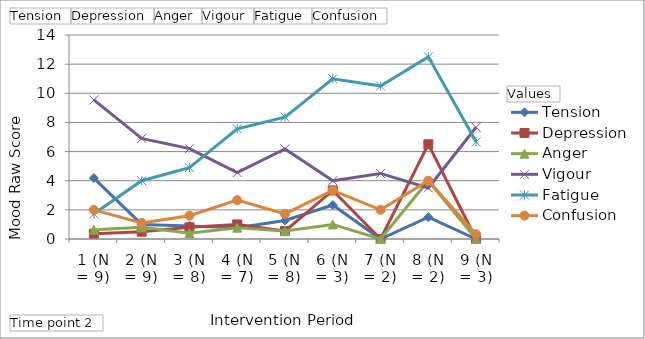
| Category | Tension | Depression | Anger | Vigour | Fatigue | Confusion |
|---|---|---|---|---|---|---|
| 1 (N = 9) | 4.182 | 0.364 | 0.636 | 9.545 | 1.727 | 2 |
| 2 (N = 9) | 1 | 0.5 | 0.8 | 6.9 | 4 | 1.1 |
| 3 (N = 8) | 0.9 | 0.8 | 0.4 | 6.2 | 4.9 | 1.6 |
| 4 (N = 7) | 0.778 | 1 | 0.778 | 4.556 | 7.556 | 2.667 |
| 5 (N = 8) | 1.273 | 0.545 | 0.545 | 6.182 | 8.364 | 1.727 |
| 6 (N = 3) | 2.333 | 3.333 | 1 | 4 | 11 | 3.333 |
| 7 (N = 2) | 0 | 0 | 0 | 4.5 | 10.5 | 2 |
| 8 (N = 2) | 1.5 | 6.5 | 4 | 3.5 | 12.5 | 4 |
| 9 (N = 3) | 0 | 0 | 0 | 7.667 | 6.667 | 0.333 |